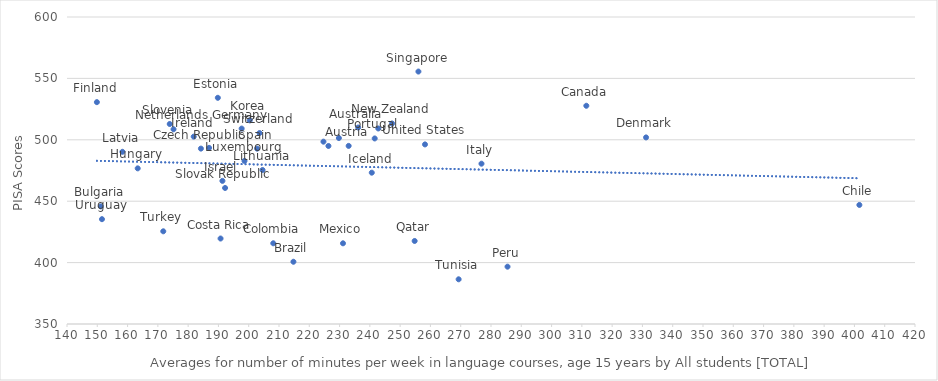
| Category | Series 0 |
|---|---|
| 236.147257788299 | 509.994 |
| 233.0 | 495.037 |
| 214.764713506876 | 400.682 |
| 151.168804261715 | 445.772 |
| 311.475788650538 | 527.705 |
| 401.632572712611 | 446.956 |
| 208.108760734503 | 415.729 |
| 190.705173097331 | 419.608 |
| 184.219540474347 | 492.83 |
| 331.198136672 | 501.937 |
| 189.801470504614 | 534.194 |
| 149.865389751796 | 530.661 |
| 226.326369275994 | 494.978 |
| 197.672982012872 | 509.141 |
| 163.346457999559 | 476.748 |
| 240.63403218393 | 473.23 |
| 181.839865930571 | 502.575 |
| 191.320425428054 | 466.553 |
| 276.85845957407 | 480.547 |
| 200.341643026063 | 515.81 |
| 158.301825309452 | 490.225 |
| 204.568604986976 | 475.409 |
| 198.610557961433 | 482.806 |
| 231.128707783885 | 415.71 |
| 175.177195940591 | 508.575 |
| 247.330189898879 | 513.304 |
| 224.682967875256 | 498.481 |
| 285.457127964414 | 396.684 |
| 229.770932601268 | 501.435 |
| 241.60016143041 | 501.1 |
| 254.789860620089 | 417.611 |
| 256.034666223336 | 555.575 |
| 192.197063451541 | 460.775 |
| 173.923388235802 | 512.864 |
| 202.765786861669 | 492.786 |
| 186.913789264498 | 493.422 |
| 203.571518550738 | 505.506 |
| 269.313187324228 | 386.403 |
| 171.787352853743 | 425.49 |
| 242.77941086249 | 509.222 |
| 258.205943436395 | 496.242 |
| 151.549763452294 | 435.363 |